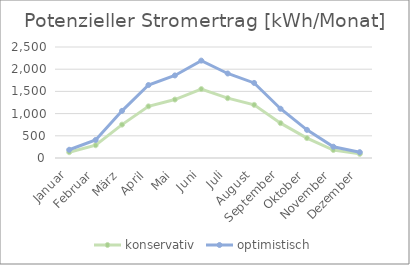
| Category | konservativ | optimistisch |
|---|---|---|
| Januar | 131.041 | 185.106 |
| Februar | 287.279 | 405.804 |
| März | 751.671 | 1061.797 |
| April | 1163.178 | 1643.084 |
| Mai | 1316.302 | 1859.384 |
| Juni | 1552.551 | 2193.106 |
| Juli | 1347.584 | 1903.573 |
| August | 1196.98 | 1690.832 |
| September | 785.345 | 1109.365 |
| Oktober | 448.704 | 633.831 |
| November | 179.855 | 254.06 |
| Dezember | 92.95 | 131.299 |